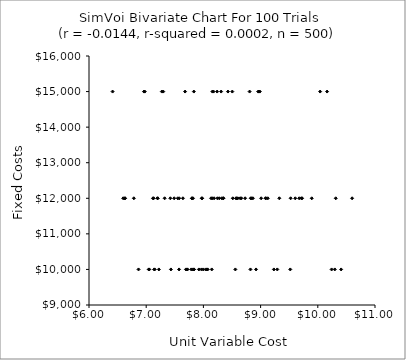
| Category | Series 0 |
|---|---|
| 8.5799233662857 | 12000 |
| 8.322798937939595 | 12000 |
| 7.201467640726995 | 12000 |
| 7.811482448741565 | 10000 |
| 9.126457782483506 | 12000 |
| 6.412461766414863 | 15000 |
| 7.719423426696527 | 10000 |
| 8.558672436460132 | 10000 |
| 7.718661596310512 | 10000 |
| 8.134011712817045 | 12000 |
| 8.277950662160677 | 12000 |
| 8.842556173277387 | 12000 |
| 7.817644752392725 | 12000 |
| 8.176340179564193 | 15000 |
| 7.4217532251195735 | 12000 |
| 6.960760332587584 | 15000 |
| 7.8313111702073375 | 10000 |
| 9.71253204860519 | 12000 |
| 9.009559051875458 | 12000 |
| 8.429496647251241 | 15000 |
| 7.8008792750240925 | 12000 |
| 8.07472128533649 | 10000 |
| 9.518861166413696 | 10000 |
| 7.970406837737856 | 12000 |
| 7.273194652571533 | 15000 |
| 7.489083048809267 | 12000 |
| 6.625377284255234 | 12000 |
| 7.128963195392983 | 12000 |
| 8.865515044995588 | 12000 |
| 9.52524895477391 | 12000 |
| 7.147236327511475 | 10000 |
| 9.605819153306468 | 12000 |
| 10.241340660086065 | 10000 |
| 10.162434953613667 | 15000 |
| 8.98643888838562 | 15000 |
| 10.407936328515019 | 10000 |
| 7.80082965003337 | 12000 |
| 6.784236433408008 | 12000 |
| 10.599768073922213 | 12000 |
| 8.643014296777642 | 12000 |
| 8.807678212906168 | 15000 |
| 8.600419279409046 | 12000 |
| 6.975359096767873 | 15000 |
| 9.086596772953316 | 12000 |
| 7.577680843721031 | 12000 |
| 7.551469433422725 | 12000 |
| 7.836890463266036 | 10000 |
| 9.326992812133225 | 12000 |
| 7.5745251901715385 | 10000 |
| 7.322483061726135 | 12000 |
| 8.822264579407284 | 10000 |
| 7.833156971276349 | 15000 |
| 9.674772377563313 | 12000 |
| 8.156055103904192 | 12000 |
| 8.157255140924462 | 15000 |
| 9.292115899744925 | 10000 |
| 9.894085944671128 | 12000 |
| 8.664326146974176 | 12000 |
| 8.570173434086822 | 12000 |
| 7.432071488580894 | 10000 |
| 10.04098471025165 | 15000 |
| 7.221376723690576 | 10000 |
| 8.505475958668336 | 15000 |
| 7.054271388777496 | 10000 |
| 8.347905742809601 | 12000 |
| 7.297879118243739 | 15000 |
| 8.245654359947244 | 12000 |
| 8.310356491929902 | 15000 |
| 7.965956030151336 | 10000 |
| 8.24025815329633 | 15000 |
| 7.999096391088855 | 10000 |
| 6.866053827382114 | 10000 |
| 8.042941091310917 | 10000 |
| 7.1412601472951 | 10000 |
| 9.724901645840218 | 12000 |
| 10.296987174791745 | 10000 |
| 8.51369282584637 | 12000 |
| 9.23186368257091 | 10000 |
| 7.9795982688006895 | 12000 |
| 7.642314292760345 | 12000 |
| 8.962169920184742 | 15000 |
| 7.0438523837948 | 10000 |
| 6.597758075026703 | 12000 |
| 7.920935150421331 | 10000 |
| 7.679708956540013 | 15000 |
| 7.196719318290606 | 12000 |
| 6.63118055024673 | 12000 |
| 8.348073995229859 | 12000 |
| 8.82716989691528 | 12000 |
| 7.69428427379326 | 10000 |
| 8.920333096546887 | 10000 |
| 8.18654853860172 | 12000 |
| 8.14617908735314 | 10000 |
| 9.092834100716615 | 12000 |
| 8.963035757919336 | 15000 |
| 7.118918414560007 | 12000 |
| 7.787961204840504 | 10000 |
| 8.729084537025106 | 12000 |
| 10.313668248811222 | 12000 |
| 8.062534990859206 | 10000 |